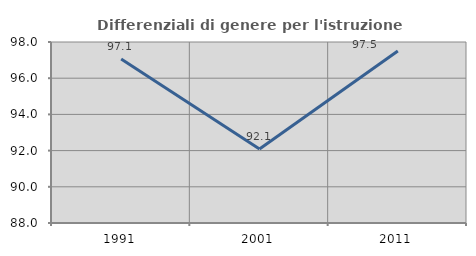
| Category | Differenziali di genere per l'istruzione superiore |
|---|---|
| 1991.0 | 97.06 |
| 2001.0 | 92.091 |
| 2011.0 | 97.499 |